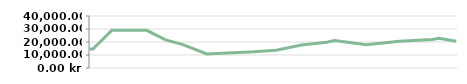
| Category | MÅNAD   |
|---|---|
| 2013-04-23 | 14600 |
| 2013-04-25 | 14600 |
| 2013-05-07 | 29000 |
| 2013-05-14 | 29000 |
| 2013-05-14 | 29000 |
| 2013-05-29 | 29000 |
| 2013-06-10 | 21600 |
| 2013-06-21 | 17950 |
| 2013-07-06 | 10776.471 |
| 2013-08-05 | 12455.862 |
| 2013-08-19 | 13667.568 |
| 2013-09-04 | 17651.667 |
| 2013-09-20 | 19877.912 |
| 2013-09-25 | 21138.05 |
| 2013-10-15 | 17951.744 |
| 2013-11-05 | 20556.13 |
| 2013-11-26 | 21997.139 |
| 2013-11-30 | 22917.635 |
| 2013-12-11 | 20504.315 |